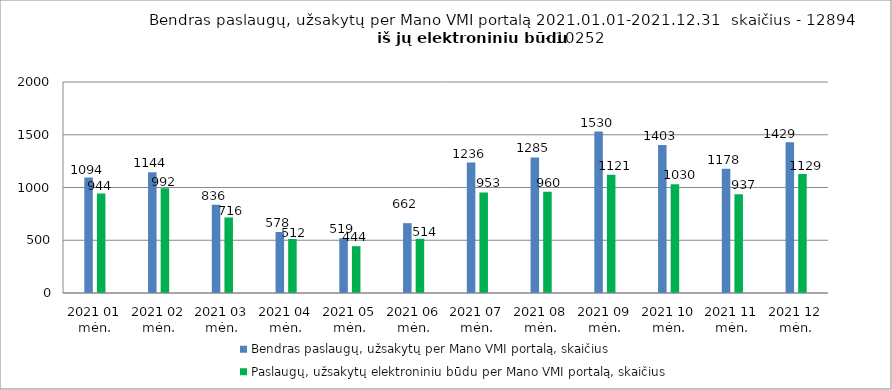
| Category | Bendras paslaugų, užsakytų per Mano VMI portalą, skaičius | Paslaugų, užsakytų elektroniniu būdu per Mano VMI portalą, skaičius |
|---|---|---|
| 2021 01 mėn. | 1094 | 944 |
| 2021 02 mėn. | 1144 | 992 |
| 2021 03 mėn. | 836 | 716 |
| 2021 04 mėn. | 578 | 512 |
| 2021 05 mėn. | 519 | 444 |
| 2021 06 mėn. | 662 | 514 |
| 2021 07 mėn. | 1236 | 953 |
| 2021 08 mėn. | 1285 | 960 |
| 2021 09 mėn. | 1530 | 1121 |
| 2021 10 mėn. | 1403 | 1030 |
| 2021 11 mėn. | 1178 | 937 |
| 2021 12 mėn. | 1429 | 1129 |